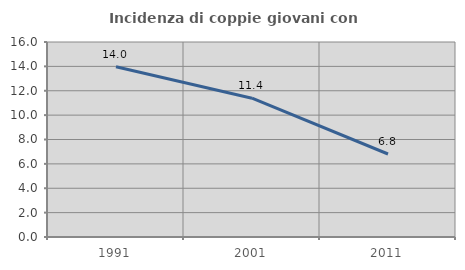
| Category | Incidenza di coppie giovani con figli |
|---|---|
| 1991.0 | 13.962 |
| 2001.0 | 11.388 |
| 2011.0 | 6.81 |